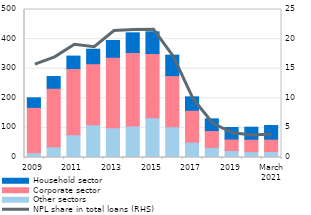
| Category | Other sectors | Corporate sector | Household sector |
|---|---|---|---|
| 2009 | 16.3 | 153.043 | 32.3 |
| 2010 | 36.3 | 197.6 | 39.6 |
| 2011 | 77.1 | 223.3 | 42.2 |
| 2012 | 110.5 | 206.3 | 49 |
| 2013 | 100.2 | 238.4 | 56.7 |
| 2014 | 106.4 | 248.4 | 66.4 |
| 2015 | 134.4 | 216.8 | 73.4 |
| 2016 | 103.8 | 172.8 | 69.2 |
| 2017 | 51.9 | 107.6 | 45.4 |
| 2018 | 34.192 | 56.849 | 39.608 |
| 2019 | 23.45 | 38.949 | 39.017 |
| 2020 | 19.835 | 41.827 | 40.747 |
| March
2021 | 20.292 | 41.688 | 46.216 |